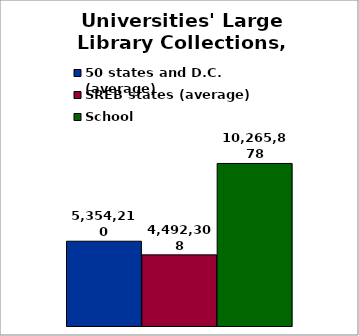
| Category | 50 states and D.C. (average) | SREB states (average) | School |
|---|---|---|---|
| 0 | 5354209.939 | 4492307.833 | 10265878 |